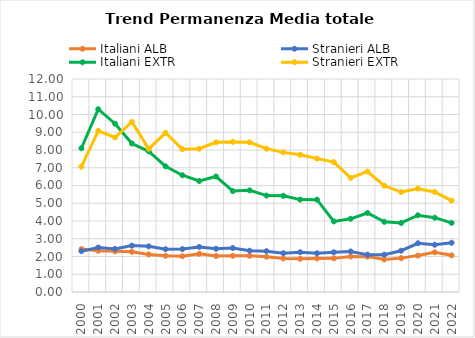
| Category | Italiani ALB | Stranieri ALB | Italiani EXTR | Stranieri EXTR |
|---|---|---|---|---|
| 2000.0 | 2.417 | 2.3 | 8.097 | 7.062 |
| 2001.0 | 2.322 | 2.51 | 10.297 | 9.08 |
| 2002.0 | 2.289 | 2.424 | 9.482 | 8.71 |
| 2003.0 | 2.263 | 2.613 | 8.366 | 9.584 |
| 2004.0 | 2.117 | 2.572 | 7.925 | 8.068 |
| 2005.0 | 2.039 | 2.41 | 7.077 | 8.969 |
| 2006.0 | 2.015 | 2.417 | 6.58 | 8.048 |
| 2007.0 | 2.152 | 2.537 | 6.252 | 8.069 |
| 2008.0 | 2.031 | 2.436 | 6.507 | 8.435 |
| 2009.0 | 2.039 | 2.477 | 5.687 | 8.456 |
| 2010.0 | 2.038 | 2.325 | 5.726 | 8.433 |
| 2011.0 | 1.986 | 2.3 | 5.433 | 8.074 |
| 2012.0 | 1.889 | 2.188 | 5.42 | 7.866 |
| 2013.0 | 1.869 | 2.241 | 5.205 | 7.732 |
| 2014.0 | 1.89 | 2.183 | 5.203 | 7.518 |
| 2015.0 | 1.895 | 2.237 | 3.976 | 7.322 |
| 2016.0 | 2 | 2.285 | 4.124 | 6.43 |
| 2017.0 | 1.992 | 2.105 | 4.452 | 6.789 |
| 2018.0 | 1.832 | 2.105 | 3.955 | 5.993 |
| 2019.0 | 1.908 | 2.326 | 3.89 | 5.631 |
| 2020.0 | 2.053 | 2.746 | 4.324 | 5.822 |
| 2021.0 | 2.236 | 2.662 | 4.188 | 5.637 |
| 2022.0 | 2.066 | 2.776 | 3.896 | 5.147 |